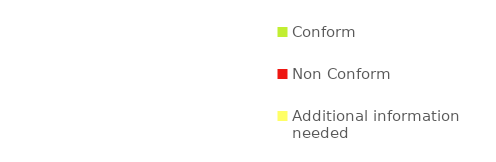
| Category | Series 0 |
|---|---|
| Conform | 0 |
| Non Conform | 0 |
| Additional information needed | 0 |